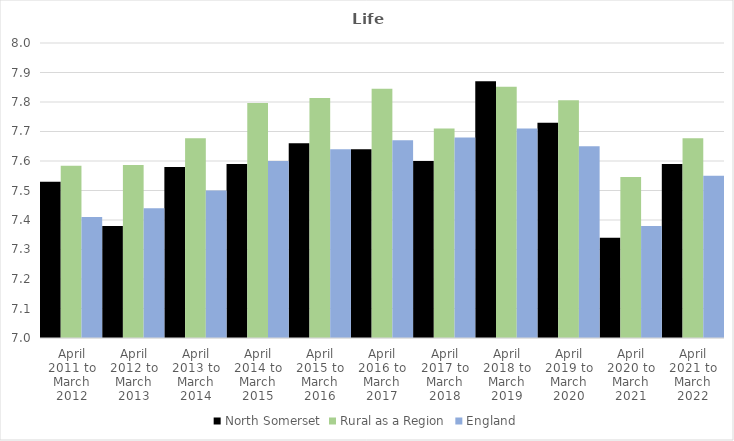
| Category | North Somerset | Rural as a Region | England |
|---|---|---|---|
| April 2011 to March 2012 | 7.53 | 7.584 | 7.41 |
| April 2012 to March 2013 | 7.38 | 7.586 | 7.44 |
| April 2013 to March 2014 | 7.58 | 7.677 | 7.5 |
| April 2014 to March 2015 | 7.59 | 7.797 | 7.6 |
| April 2015 to March 2016 | 7.66 | 7.813 | 7.64 |
| April 2016 to March 2017 | 7.64 | 7.845 | 7.67 |
| April 2017 to March 2018 | 7.6 | 7.71 | 7.68 |
| April 2018 to March 2019 | 7.87 | 7.852 | 7.71 |
| April 2019 to March 2020 | 7.73 | 7.806 | 7.65 |
| April 2020 to March 2021 | 7.34 | 7.546 | 7.38 |
| April 2021 to March 2022 | 7.59 | 7.677 | 7.55 |